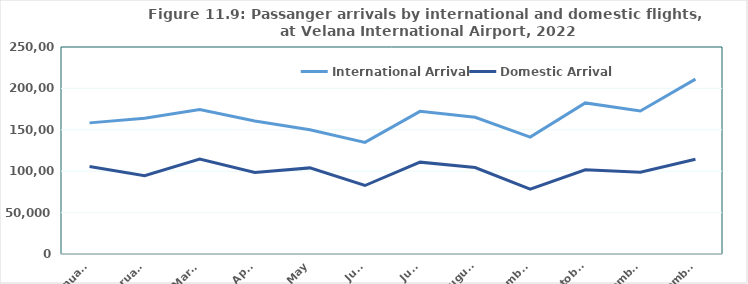
| Category | International Arrival | Domestic Arrival |
|---|---|---|
| January | 158370 | 105586 |
| February | 164017 | 94451 |
| March | 174520 | 114733 |
| April | 160708 | 98431 |
| May | 150048 | 104006 |
| June | 134750 | 82713 |
| July | 172277 | 110938 |
| August | 165071 | 104446 |
| September | 141138 | 78291 |
| October | 182492 | 101787 |
| November | 172713 | 98729 |
| December | 211232 | 114505 |